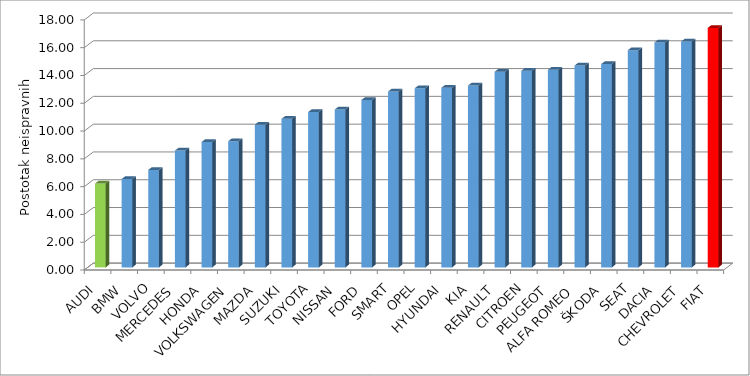
| Category | Series 4 |
|---|---|
| AUDI | 6.035 |
| BMW | 6.36 |
| VOLVO | 7.016 |
| MERCEDES | 8.407 |
| HONDA | 9.023 |
| VOLKSWAGEN | 9.08 |
| MAZDA | 10.27 |
| SUZUKI | 10.69 |
| TOYOTA | 11.177 |
| NISSAN | 11.367 |
| FORD | 12.049 |
| SMART | 12.658 |
| OPEL | 12.889 |
| HYUNDAI | 12.927 |
| KIA | 13.085 |
| RENAULT | 14.08 |
| CITROEN | 14.152 |
| PEUGEOT | 14.222 |
| ALFA ROMEO | 14.527 |
| ŠKODA | 14.63 |
| SEAT | 15.633 |
| DACIA | 16.191 |
| CHEVROLET | 16.252 |
| FIAT | 17.235 |